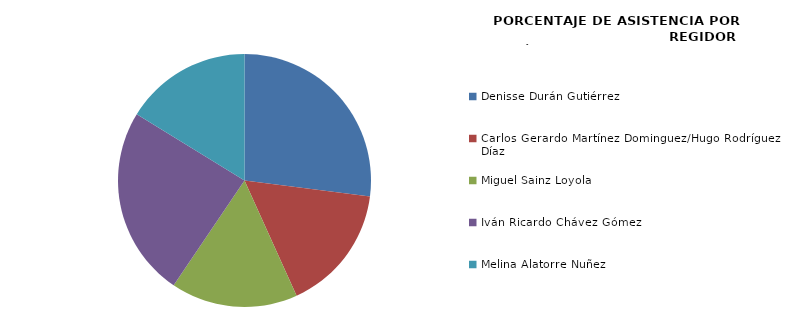
| Category | Series 0 |
|---|---|
| Denisse Durán Gutiérrez | 100 |
| Carlos Gerardo Martínez Dominguez/Hugo Rodríguez Díaz | 60 |
| Miguel Sainz Loyola | 60 |
| Iván Ricardo Chávez Gómez | 90 |
| Melina Alatorre Nuñez | 60 |